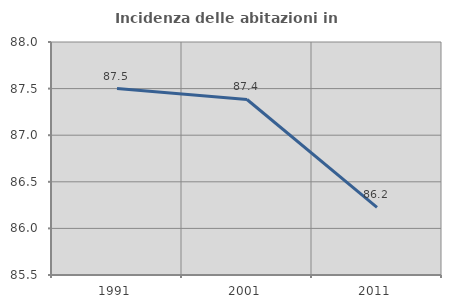
| Category | Incidenza delle abitazioni in proprietà  |
|---|---|
| 1991.0 | 87.5 |
| 2001.0 | 87.383 |
| 2011.0 | 86.226 |